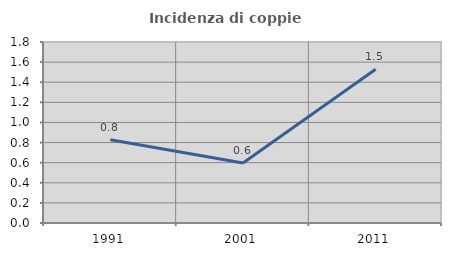
| Category | Incidenza di coppie miste |
|---|---|
| 1991.0 | 0.828 |
| 2001.0 | 0.596 |
| 2011.0 | 1.529 |